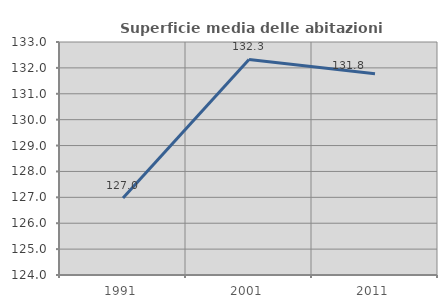
| Category | Superficie media delle abitazioni occupate |
|---|---|
| 1991.0 | 126.971 |
| 2001.0 | 132.326 |
| 2011.0 | 131.771 |